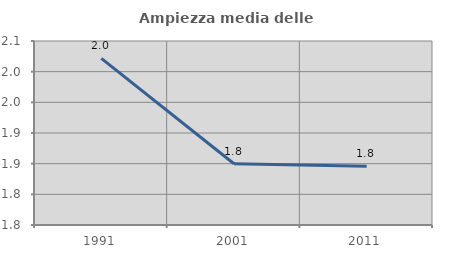
| Category | Ampiezza media delle famiglie |
|---|---|
| 1991.0 | 2.022 |
| 2001.0 | 1.85 |
| 2011.0 | 1.846 |